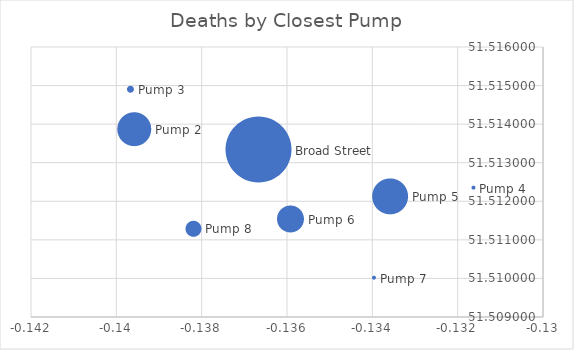
| Category | Series 0 |
|---|---|
| -0.136668 | 51.513 |
| -0.139586 | 51.514 |
| -0.139671 | 51.515 |
| -0.13163 | 51.512 |
| -0.133594 | 51.512 |
| -0.135919 | 51.512 |
| -0.133962 | 51.51 |
| -0.138199 | 51.511 |